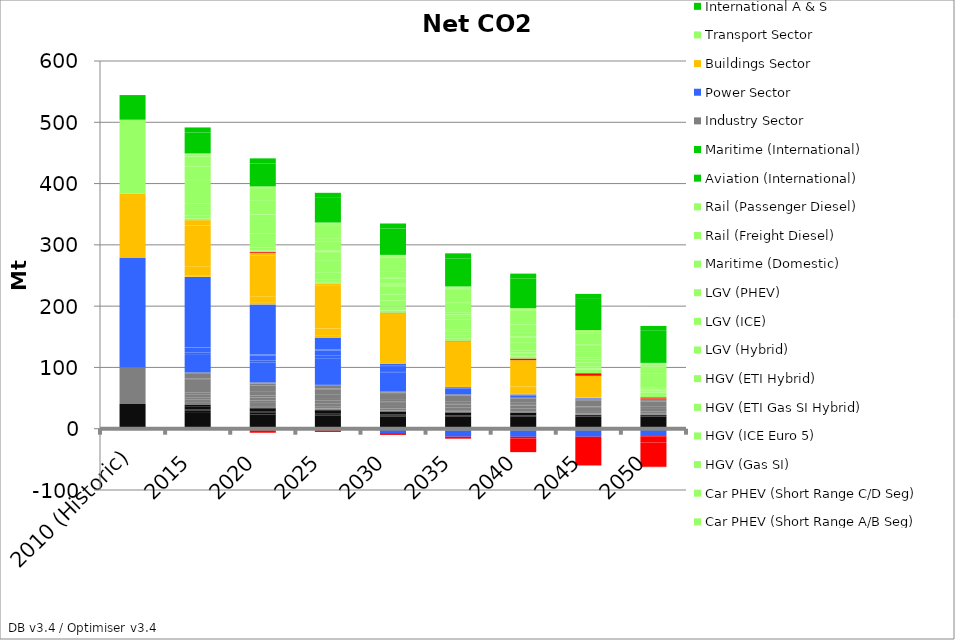
| Category | Process and other CO2 | Other CO2 emissions | I1 Industry process emissions | I1 Industry process emissions with CCS | I2 Industry process emissions | I2 Industry process emissions with CCS | I6 Industry process emissions | I6 Industry process emissions with CCS | I7 Industry process emissions | I1 Industry (Iron, Steel, Metals) | I1a Industry + CCS (Iron, Steel, Metals) | I1g Industry + hydrogen (Iron, Steel, Metals) | I2b Industry + Bio (Chemicals) | I2c Industry + Bio + CCS (Chemicals) | I2e Industry + Gas (Chemicals) | I2f Industry + Gas + CCS (Chemicals) | I2g Industry + hydrogen (Chemicals) | I3 Industry (Metal Products) | I4 Industry (Food, drinks, tobacco) | I5 Industry (Paper, printing, publishing) | I6 Industry (Other) | I6b Industry + Bio (Other) | I6c Industry + Bio + CCS (Other) | I6g Industry + hydrogen (Other) | I7b Industry + Bio (Refining) | I7c Industry + Bio + CCS (Refining) | I7e Industry + Gas (Refining) | I7f Industry + Gas + CCS (Refining) | I7g Industry + hydrogen (Refining) | I8 Industry (Agriculture) | CCGT | CCGT with CCS | Converted Biomass Plant | Incineration of Waste | Waste Gasification to power (A) | Waste Gasification to power (B) | Waste Gasification to power with CCS | Biomass Macro CHP | Gas Macro CHP | OCGT | Oil Fired Generation | PC Coal | Biomass Boiler - Hot Water | Biomass Boiler - Space Heat | District Heating Gas Boiler | Domestic Cooking (Gas) | Gas Boiler - Hot Water | Gas Boiler - Space Heat | Oil Boiler - Hot Water | Oil Boiler - Space Heat | Anaerobic Digestion Gas Plant | Biodiesel Production | Biofuel Import Blend | Biomass Fired Generation | Biomass Importing | Biopetrol Production with CCS | H2 Plant (Biomass Gasification with CCS) | H2 Plant (Coal Gasification with CCS) | Aviation (Domestic) | Bus (Dual Fuel Direct) | Bus (Gas SI) | Bus (ICE) | Car Hybrid (A/B Segment) | Car Hybrid (C/D Segment) | Car ICE (A/B Segment) | Car ICE (C/D Segment) | Car PHEV (Long Range A/B Seg) | Car PHEV (Long Range C/D Seg) | Car PHEV (Med Range A/B Seg) | Car PHEV (Med Range C/D Seg) | Car PHEV (Short Range A/B Seg) | Car PHEV (Short Range C/D Seg) | HGV (Gas SI) | HGV (ICE Euro 5) | HGV (ETI Gas SI Hybrid) | HGV (ETI Hybrid) | LGV (Hybrid) | LGV (ICE) | LGV (PHEV) | Maritime (Domestic) | Rail (Freight Diesel) | Rail (Passenger Diesel) | Aviation (International) | Maritime (International) | Industry Sector | Power Sector | Buildings Sector | Transport Sector | International A & S |
|---|---|---|---|---|---|---|---|---|---|---|---|---|---|---|---|---|---|---|---|---|---|---|---|---|---|---|---|---|---|---|---|---|---|---|---|---|---|---|---|---|---|---|---|---|---|---|---|---|---|---|---|---|---|---|---|---|---|---|---|---|---|---|---|---|---|---|---|---|---|---|---|---|---|---|---|---|---|---|---|---|---|---|---|---|---|---|---|---|---|
| 2010 (Historic) | 40.4 | 0 | 0 | 0 | 0 | 0 | 0 | 0 | 0 | 0 | 0 | 0 | 0 | 0 | 0 | 0 | 0 | 0 | 0 | 0 | 0 | 0 | 0 | 0 | 0 | 0 | 0 | 0 | 0 | 0 | 0 | 0 | 0 | 0 | 0 | 0 | 0 | 0 | 0 | 0 | 0 | 0 | 0 | 0 | 0 | 0 | 0 | 0 | 0 | 0 | 0 | 0 | 0 | 0 | 0 | 0 | 0 | 0 | 0 | 0 | 0 | 0 | 0 | 0 | 0 | 0 | 0 | 0 | 0 | 0 | 0 | 0 | 0 | 0 | 0 | 0 | 0 | 0 | 0 | 0 | 0 | 0 | 0 | 0 | 59.5 | 178.8 | 104.9 | 120.6 | 40.2 |
| 2015 | 0 | 25.79 | 4.049 | 0 | 1.677 | 0 | 5.173 | 0 | 2.056 | 3.388 | 0 | 0 | 0 | 0 | 5.182 | 0 | 0 | 4.045 | 4.888 | 3.163 | 21.462 | 0 | 0 | 0 | 0.818 | 0 | 8.834 | 0 | 0 | 1.305 | 29.917 | 0 | 0.025 | 2.66 | 8.137 | 0 | 0 | 0 | 0 | 0.251 | 0.008 | 114.868 | 0.033 | 0.261 | 0 | 1.784 | 14.404 | 67.155 | 1.04 | 7.957 | 0 | -0.087 | -2.03 | 0.003 | 0 | 0 | 0 | 0 | 2.3 | 0 | 0.077 | 4.42 | 0.498 | 0.18 | 20.144 | 37.75 | 0.001 | 0.001 | 0.002 | 0.002 | 0.004 | 0.004 | 0.264 | 21.641 | 0 | 0 | 0 | 16.742 | 0.046 | 2.632 | 0.989 | 1.145 | 34.258 | 8.157 | 0 | 0 | 0 | 0 | 0 |
| 2020 | 0 | 23.31 | 2.873 | 0 | 1.608 | 0 | 5.005 | 0 | 1.689 | 2.443 | 0 | 0 | 0 | 0 | 5.204 | 0 | 0 | 4.021 | 4.917 | 3.007 | 7.266 | 9.036 | 0 | 0 | 3.109 | 0 | 0.677 | 0 | 0 | 1.346 | 32.225 | 0 | 0.025 | 3.409 | 8.137 | 0.444 | -0.287 | 0.022 | 1.029 | 0.211 | 0 | 81.736 | 0.04 | 0.132 | 0 | 2.414 | 10.538 | 65.802 | 0.605 | 4.564 | 0 | -0.087 | -3.19 | 0.002 | 1.358 | -3.004 | 0 | -0.012 | 2.502 | 0 | 0.208 | 4.469 | 0.498 | 2.691 | 20.219 | 30.087 | 0.066 | 0.121 | 0.002 | 0.204 | 0.004 | 0.004 | 0.71 | 21.869 | 0 | 0 | 0 | 19.375 | 0.132 | 1.931 | 0.989 | 1.154 | 37.488 | 8.201 | 0 | 0 | 0 | 0 | 0 |
| 2025 | 0 | 21.34 | 2.409 | 0 | 1.531 | 0 | 4.795 | 0 | 0.641 | 2.033 | 0 | 0 | 0.209 | 0.176 | 0.734 | 2.88 | 0 | 3.991 | 4.946 | 2.852 | 7.798 | 8.032 | 0 | 0 | 1.172 | 0 | 4.659 | 0 | 0 | 1.389 | 43.406 | 0 | 0 | 4.158 | 8.137 | 0.444 | -2.203 | 0.022 | 1.364 | 0.186 | 0 | 19.399 | 0 | 0 | 0 | 2.92 | 11.76 | 70.821 | 0.267 | 1.894 | 0 | -0.087 | 0 | 0.002 | 0 | -3.003 | 0 | 0.076 | 2.685 | 0 | 0.429 | 4.362 | 0.291 | 11.202 | 18.482 | 14.211 | 0.168 | 0.232 | 0.162 | 0.392 | 0.002 | 0.213 | 1.463 | 14.524 | 0 | 5.727 | 0 | 21.284 | 0.273 | 1.64 | 0.985 | 1.272 | 40.256 | 8.218 | 0 | 0 | 0 | 0 | 0 |
| 2030 | 0 | 19.83 | 2.025 | 0 | 1.454 | 0 | 4.561 | 0 | 0.57 | 0.25 | 1.119 | 0 | 0 | 0.48 | 0 | 2.865 | 0 | 3.967 | 4.985 | 2.694 | 2.176 | 11.144 | 0 | 0 | 0.679 | -2.026 | 0 | 0.281 | 0 | 1.437 | 31.606 | 0 | 0 | 1.92 | 8.136 | 0.444 | -5.011 | 0.128 | 2.918 | 0.114 | 0 | 0.267 | 0 | 0.018 | 0.004 | 2.943 | 11.274 | 68.244 | 0 | 0.003 | 0 | -0.085 | 0 | 0.001 | 0.82 | -2.967 | 0 | -0.073 | 2.875 | 0 | 0.725 | 4.105 | 2.275 | 9.624 | 10.035 | 13.602 | 0.129 | 0.16 | 0.161 | 0.27 | 2.545 | 0.459 | 1.2 | 7.572 | 1.061 | 10.881 | 0.12 | 22.292 | 0.457 | 1.403 | 0.979 | 1.366 | 42.991 | 8.219 | 0 | 0 | 0 | 0 | 0 |
| 2035 | 0 | 19.83 | 1.756 | 0 | 0 | 0.311 | 4.418 | 0 | 0.533 | 0 | 1.079 | 0 | 0 | 0.907 | 0 | 1.472 | 0 | 3.95 | 5.037 | 2.531 | 2.082 | 10.465 | 0 | 0 | 0 | -2.692 | 0 | 0.249 | 0 | 1.492 | 9.603 | 0.853 | 0 | 0.078 | 0 | 0.314 | -10.388 | 0.041 | 1.038 | 0.05 | 0 | 0 | 0 | 0.082 | 0.013 | 2.961 | 11.701 | 60.127 | 0 | 0.003 | 0 | -0.087 | 0 | 0.001 | 0.566 | -3.004 | 0 | -0.215 | 3.074 | 0 | 1.221 | 3.626 | 3.014 | 4.448 | 2.624 | 16.277 | 0.041 | 0.045 | 0.064 | 0.076 | 5.757 | 1.685 | 0.754 | 0 | 2.852 | 15.914 | 0.372 | 22.446 | 0.739 | 1.19 | 0.969 | 1.462 | 45.763 | 8.206 | 0 | 0 | 0 | 0 | 0 |
| 2040 | 0 | 19.83 | 1.507 | 0 | 0 | 0.312 | 4.288 | 0 | 0.5 | 0 | 0.886 | 0 | 0 | 1.313 | 0 | 0.094 | 0 | 3.939 | 5.101 | 2.364 | 0 | 0 | 2.111 | 6.547 | 0 | -2.587 | 0 | 0.218 | 0 | 1.554 | 3.402 | 0.929 | 0 | 0 | 0 | 0 | -10.597 | 0.041 | 1.038 | 0.003 | 0 | 0 | 0 | 0.078 | 0.047 | 1.898 | 10.87 | 43.013 | 0 | 0 | 0 | 0 | 0 | 0 | 2.669 | -3.004 | -21.843 | -0.214 | 3.287 | 0.937 | 1 | 2.685 | 1.667 | 3.07 | 0 | 13.96 | 0 | 0 | 0 | 0 | 7.229 | 2.066 | 0 | 0 | 5.867 | 13.743 | 0.774 | 21.335 | 1.186 | 0.992 | 0.961 | 1.57 | 48.029 | 8.181 | 0 | 0 | 0 | 0 | 0 |
| 2045 | 0 | 19.83 | 0 | 0.709 | 0 | 0.313 | 0 | 1.408 | 0.471 | 0 | 0 | 0.244 | 0 | 0 | 0 | 0 | 1.906 | 3.934 | 5.18 | 2.192 | 0 | 0 | 0.113 | 9.249 | 0 | -2.481 | 0 | 0 | 0.113 | 1.626 | 0.504 | 1.031 | 0 | 0 | 0 | 0 | -10.597 | 0.041 | 1.037 | 0.003 | 0 | 0 | 0 | 0.064 | 0.052 | 0.949 | 5.679 | 29.732 | 0 | 0 | 0 | 0 | 0 | 0 | 4.158 | 0 | -46.791 | -0.207 | 3.476 | 2.101 | 0.628 | 1.614 | 0.317 | 2.47 | 0 | 6.296 | 0 | 0 | 1.125 | 0 | 4.284 | 3.817 | 0 | 0 | 9.871 | 9.863 | 1.288 | 18.186 | 1.885 | 0.826 | 0.952 | 1.55 | 50.736 | 8.178 | 0 | 0 | 0 | 0 | 0 |
| 2050 | 0 | 19.83 | 0 | 0.601 | 0 | 0.316 | 0 | 1.347 | 0.444 | 0 | 0 | 0.203 | 0 | 0 | 0 | 0 | 1.766 | 3.935 | 5.276 | 2.015 | 0 | 0 | 0 | 8.494 | 0 | 0 | 0 | 0 | 1.24 | 1.707 | 0 | 1.379 | 0 | 0 | 0 | 0 | -10.597 | 0.016 | 0 | 0.003 | 0 | 0 | 0 | 0 | 0.096 | 0 | 0.047 | 0.424 | 0.003 | 0.02 | -1.746 | 0 | -10.15 | 0 | 2.079 | 0 | -39.514 | -0.663 | 3.599 | 3.344 | 0 | 0.691 | 0 | 0.828 | 0 | 1.596 | 0.272 | 0 | 1.125 | 1.004 | 1.2 | 2.907 | 0 | 0 | 14.897 | 4.829 | 2.023 | 11.733 | 2.96 | 0.699 | 0.946 | 1.52 | 52.396 | 7.857 | 0 | 0 | 0 | 0 | 0 |